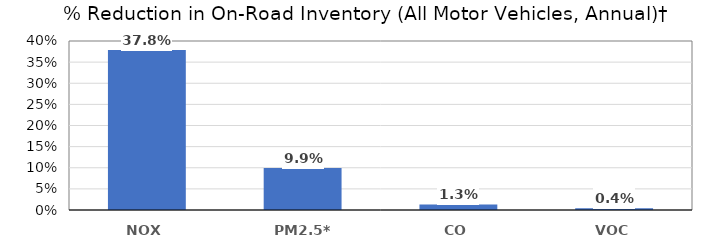
| Category | Series 0 |
|---|---|
| NOX | 0.378 |
| PM2.5** | 0.099 |
| CO | 0.013 |
| VOC | 0.004 |